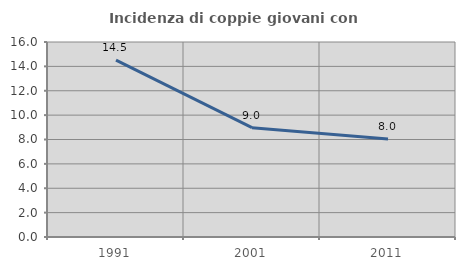
| Category | Incidenza di coppie giovani con figli |
|---|---|
| 1991.0 | 14.52 |
| 2001.0 | 8.967 |
| 2011.0 | 8.04 |